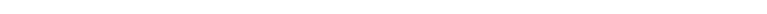
| Category | 'Деп-Кред'!#REF! |
|---|---|
| 0 | 1 |